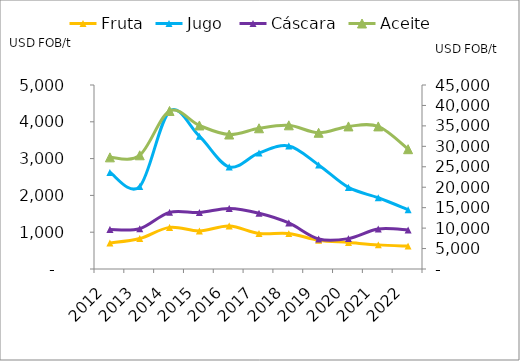
| Category | Fruta | Jugo  | Cáscara |
|---|---|---|---|
| 2012.0 | 706 | 2623 | 1076 |
| 2013.0 | 828 | 2243 | 1095 |
| 2014.0 | 1131 | 4287 | 1540 |
| 2015.0 | 1033 | 3609 | 1535 |
| 2016.0 | 1169 | 2774 | 1645 |
| 2017.0 | 967.424 | 3154.078 | 1516.574 |
| 2018.0 | 962.42 | 3343.706 | 1252.182 |
| 2019.0 | 782 | 2827.585 | 815.103 |
| 2020.0 | 720.393 | 2216.556 | 825.845 |
| 2021.0 | 655.58 | 1935.426 | 1085.857 |
| 2022.0 | 622.37 | 1611.474 | 1059.422 |